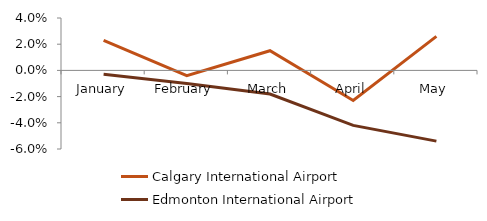
| Category | Calgary International Airport | Edmonton International Airport |
|---|---|---|
| January | 0.023 | -0.003 |
| February | -0.004 | -0.01 |
| March | 0.015 | -0.018 |
| April | -0.023 | -0.042 |
| May | 0.026 | -0.054 |